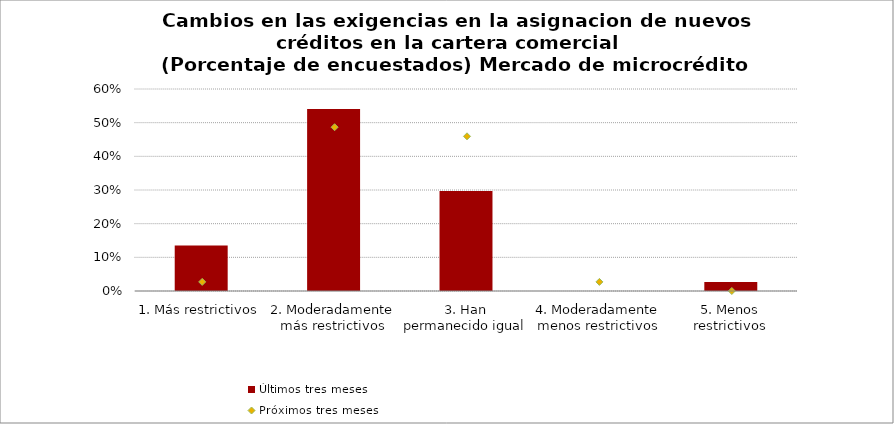
| Category | Últimos tres meses |
|---|---|
| 1. Más restrictivos | 0.135 |
| 2. Moderadamente más restrictivos | 0.541 |
| 3. Han permanecido igual | 0.297 |
| 4. Moderadamente menos restrictivos | 0 |
| 5. Menos restrictivos | 0.027 |